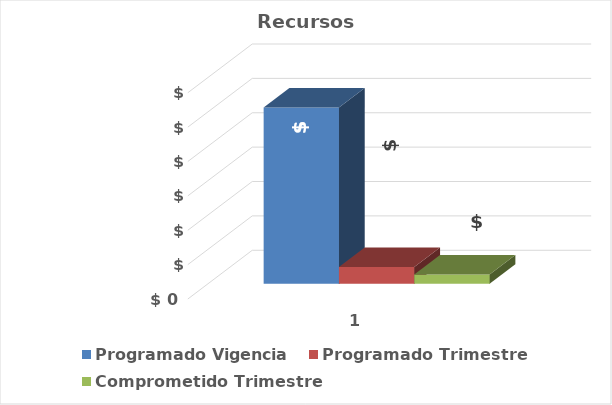
| Category | Programado Vigencia | Programado Trimestre | Comprometido Trimestre |
|---|---|---|---|
| 0 | 512815800392 | 48464679591.42 | 26557091737.13 |